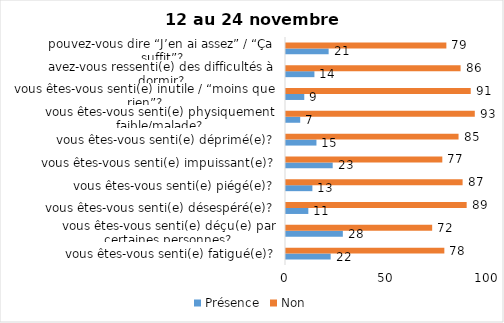
| Category | Présence | Non |
|---|---|---|
| vous êtes-vous senti(e) fatigué(e)? | 22 | 78 |
| vous êtes-vous senti(e) déçu(e) par certaines personnes? | 28 | 72 |
| vous êtes-vous senti(e) désespéré(e)? | 11 | 89 |
| vous êtes-vous senti(e) piégé(e)? | 13 | 87 |
| vous êtes-vous senti(e) impuissant(e)? | 23 | 77 |
| vous êtes-vous senti(e) déprimé(e)? | 15 | 85 |
| vous êtes-vous senti(e) physiquement faible/malade? | 7 | 93 |
| vous êtes-vous senti(e) inutile / “moins que rien”? | 9 | 91 |
| avez-vous ressenti(e) des difficultés à dormir? | 14 | 86 |
| pouvez-vous dire “J’en ai assez” / “Ça suffit”? | 21 | 79 |